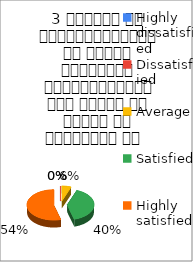
| Category | 3 शिक्षक का विद्यार्थियों के प्रति व्यव्हार मित्रतापूर्ण एवं सहयोग के भावना से परिपूर्ण था   |
|---|---|
| Highly dissatisfied | 0 |
| Dissatisfied | 0 |
| Average | 2 |
| Satisfied | 14 |
| Highly satisfied | 19 |